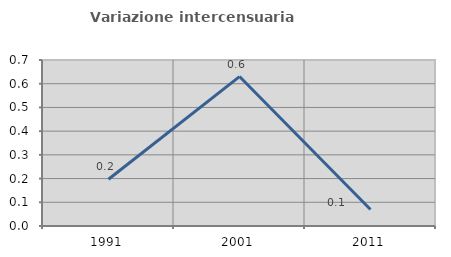
| Category | Variazione intercensuaria annua |
|---|---|
| 1991.0 | 0.197 |
| 2001.0 | 0.63 |
| 2011.0 | 0.07 |